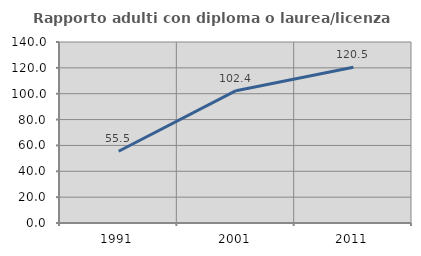
| Category | Rapporto adulti con diploma o laurea/licenza media  |
|---|---|
| 1991.0 | 55.51 |
| 2001.0 | 102.36 |
| 2011.0 | 120.513 |